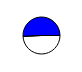
| Category | Series 0 |
|---|---|
| 0 | 8065458 |
| 1 | 8342019 |